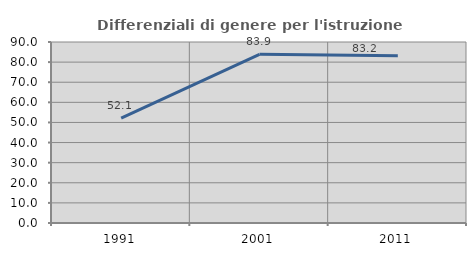
| Category | Differenziali di genere per l'istruzione superiore |
|---|---|
| 1991.0 | 52.128 |
| 2001.0 | 83.895 |
| 2011.0 | 83.182 |